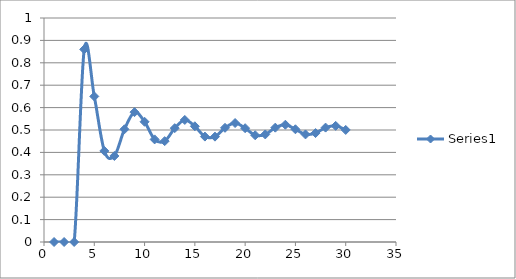
| Category | Series 0 |
|---|---|
| 0 | 0 |
| 1 | 0 |
| 2 | 0 |
| 3 | 0.86 |
| 4 | 0.65 |
| 5 | 0.407 |
| 6 | 0.384 |
| 7 | 0.503 |
| 8 | 0.58 |
| 9 | 0.537 |
| 10 | 0.458 |
| 11 | 0.45 |
| 12 | 0.508 |
| 13 | 0.545 |
| 14 | 0.517 |
| 15 | 0.471 |
| 16 | 0.47 |
| 17 | 0.51 |
| 18 | 0.531 |
| 19 | 0.508 |
| 20 | 0.477 |
| 21 | 0.48 |
| 22 | 0.51 |
| 23 | 0.524 |
| 24 | 0.503 |
| 25 | 0.48 |
| 26 | 0.486 |
| 27 | 0.511 |
| 28 | 0.518 |
| 29 | 0.5 |